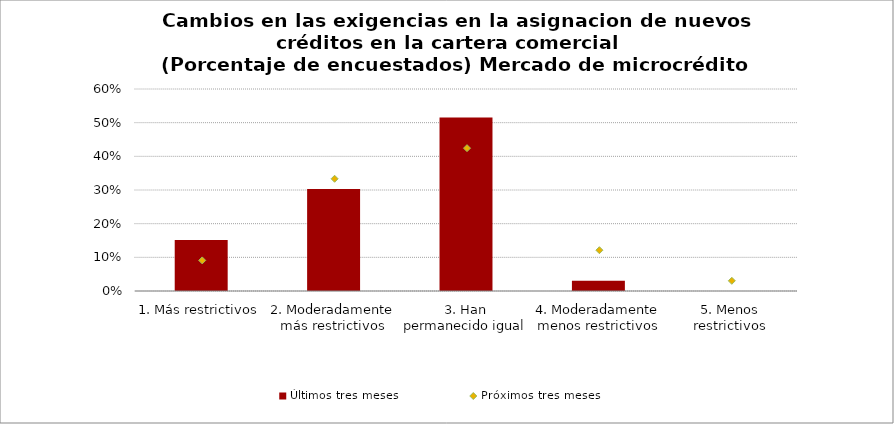
| Category | Últimos tres meses |
|---|---|
| 1. Más restrictivos | 0.152 |
| 2. Moderadamente más restrictivos | 0.303 |
| 3. Han permanecido igual | 0.515 |
| 4. Moderadamente menos restrictivos | 0.03 |
| 5. Menos restrictivos | 0 |